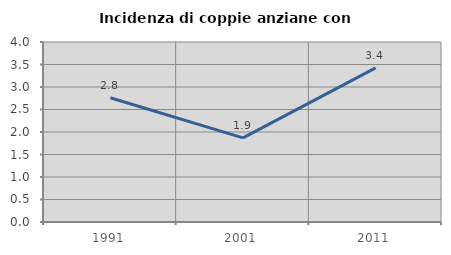
| Category | Incidenza di coppie anziane con figli |
|---|---|
| 1991.0 | 2.761 |
| 2001.0 | 1.869 |
| 2011.0 | 3.425 |